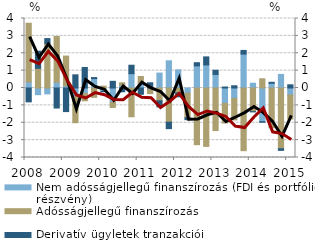
| Category | Nem adósságjellegű finanszírozás (FDI és portfólió részvény) | Adósságjellegű finanszírozás | Derivatív ügyletek tranzakciói |
|---|---|---|---|
| 2008.0 | 0.348 | 3.381 | -0.797 |
| 2008.0 | -0.385 | 1.131 | 0.986 |
| 2008.0 | -0.338 | 2.551 | 0.292 |
| 2008.0 | 0.334 | 2.628 | -1.152 |
| 2009.0 | 0.125 | 1.714 | -1.358 |
| 2009.0 | -0.495 | -1.502 | 0.758 |
| 2009.0 | -0.31 | -0.426 | 1.181 |
| 2009.0 | 0.54 | -0.537 | 0.06 |
| 2010.0 | -0.188 | 0.108 | -0.028 |
| 2010.0 | -0.819 | -0.301 | 0.384 |
| 2010.0 | 0.167 | 0.134 | -0.216 |
| 2010.0 | 0.825 | -1.656 | 0.485 |
| 2011.0 | 0.28 | 0.384 | -0.362 |
| 2011.0 | -0.045 | -0.279 | 0.301 |
| 2011.0 | 0.858 | -0.734 | -0.355 |
| 2011.0 | 1.566 | -1.967 | -0.372 |
| 2012.0 | 1.048 | -0.279 | -0.228 |
| 2012.0 | -0.293 | -1.418 | -0.112 |
| 2012.0 | 1.271 | -3.263 | 0.185 |
| 2012.0 | 1.329 | -3.361 | 0.461 |
| 2013.0 | 0.783 | -2.451 | 0.238 |
| 2013.0 | -0.888 | -1.127 | 0.057 |
| 2013.0 | -0.599 | -1.241 | 0.129 |
| 2013.0 | 1.95 | -3.607 | 0.212 |
| 2014.0 | 0.275 | -1.358 | -0.017 |
| 2014.0 | -1.937 | 0.53 | -0.035 |
| 2014.0 | 0.27 | -2.289 | 0.058 |
| 2014.0 | 0.781 | -3.496 | -0.093 |
| 2015.0 | -0.404 | -1.379 | 0.184 |